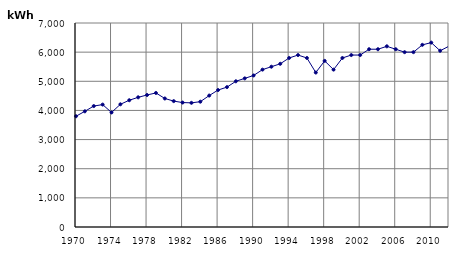
| Category | kWh |
|---|---|
| 1970 | 3800 |
| 1971 | 3970 |
| 1972 | 4150 |
| 1973 | 4200 |
| 1974 | 3930 |
| 1975 | 4210 |
| 1976 | 4350 |
| 1977 | 4450 |
| 1978 | 4530 |
| 1979 | 4600 |
| 1980 | 4410 |
| 1981 | 4320 |
| 1982 | 4270 |
| 1983 | 4260 |
| 1984 | 4300 |
| 1985 | 4510 |
| 1986 | 4700 |
| 1987 | 4800 |
| 1988 | 5000 |
| 1989 | 5100 |
| 1990 | 5200 |
| 1991 | 5400 |
| 1992 | 5500 |
| 1993 | 5600 |
| 1994 | 5800 |
| 1995 | 5900 |
| 1996 | 5800 |
| 1997 | 5300 |
| 1998 | 5700 |
| 1999 | 5400 |
| 2000 | 5800 |
| 2001 | 5900 |
| 2002 | 5900 |
| 2003 | 6100 |
| 2004 | 6100 |
| 2005 | 6200 |
| 2006 | 6100 |
| 2007 | 6000 |
| 2008 | 6000 |
| 2009 | 6249.909 |
| 2010 | 6326.873 |
| 2011 | 6047.482 |
| 2012 | 6204.612 |